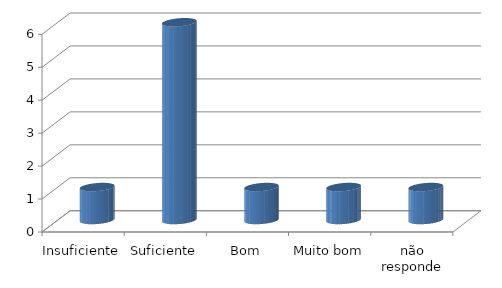
| Category | Series 0 |
|---|---|
| Insuficiente | 1 |
| Suficiente | 6 |
| Bom | 1 |
| Muito bom | 1 |
| não responde | 1 |